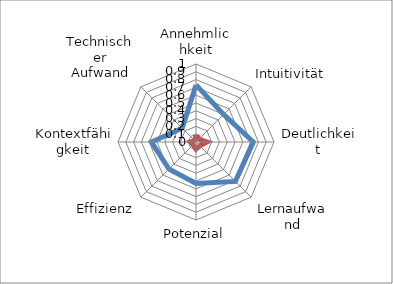
| Category | DHR | Series 1 |
|---|---|---|
| Annehmlichkeit | 0.732 | 0.087 |
| Intuitivität | 0.5 | 0.051 |
| Deutlichkeit | 0.735 | 0.14 |
| Lernaufwand | 0.714 | 0.068 |
| Potenzial | 0.531 | 0.091 |
| Effizienz | 0.49 | 0.051 |
| Kontextfähigkeit | 0.571 | 0.072 |
| Technischer Aufwand | 0.25 | 0.023 |